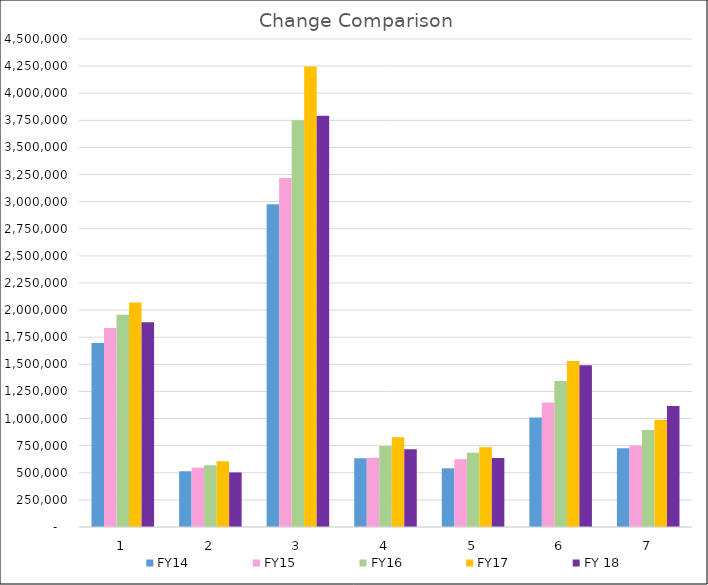
| Category | FY14 | FY15 | FY16 | FY17 | FY 18 |
|---|---|---|---|---|---|
| 0 | 1697413.69 | 1835663.78 | 1956207.25 | 2071290.66 | 1889216.43 |
| 1 | 514097.08 | 547790.16 | 568881.38 | 607325.72 | 503410.7 |
| 2 | 2975568.42 | 3217944.64 | 3749759.46 | 4247363.68 | 3792137.55 |
| 3 | 633266.07 | 638402.21 | 747902.56 | 828732.03 | 717071.02 |
| 4 | 541250.65 | 625195.14 | 683574.65 | 735454.7 | 635448.71 |
| 5 | 1009130.99 | 1146939.29 | 1347396.33 | 1529829.21 | 1490394.79 |
| 6 | 726546.4 | 751460.76 | 893765.74 | 986386.67 | 1114693.12 |